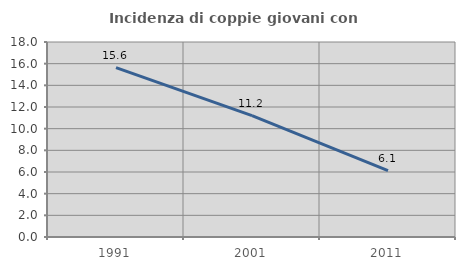
| Category | Incidenza di coppie giovani con figli |
|---|---|
| 1991.0 | 15.64 |
| 2001.0 | 11.209 |
| 2011.0 | 6.133 |